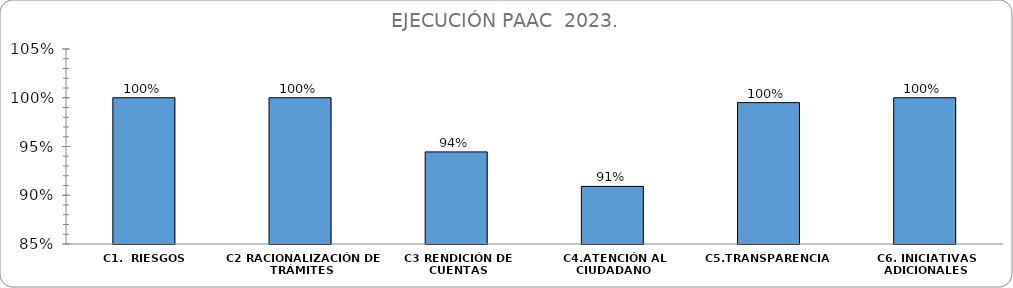
| Category | % CUMPLIMIENTO  |
|---|---|
| C1.  RIESGOS | 1 |
| C2 RACIONALIZACIÓN DE TRÁMITES | 1 |
| C3 RENDICIÓN DE CUENTAS | 0.944 |
| C4.ATENCIÓN AL CIUDADANO | 0.909 |
| C5.TRANSPARENCIA  | 0.995 |
| C6. INICIATIVAS ADICIONALES | 1 |